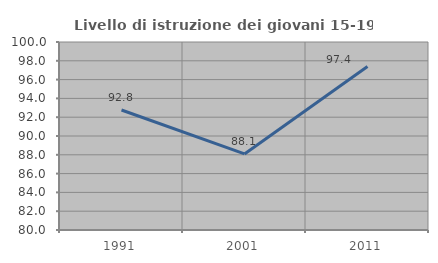
| Category | Livello di istruzione dei giovani 15-19 anni |
|---|---|
| 1991.0 | 92.766 |
| 2001.0 | 88.095 |
| 2011.0 | 97.403 |